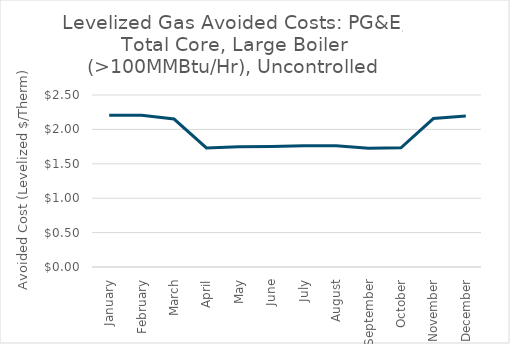
| Category | New Total |
|---|---|
| January | 2.207 |
| February | 2.204 |
| March | 2.151 |
| April | 1.73 |
| May | 1.747 |
| June | 1.752 |
| July | 1.762 |
| August | 1.762 |
| September | 1.725 |
| October | 1.733 |
| November | 2.158 |
| December | 2.194 |